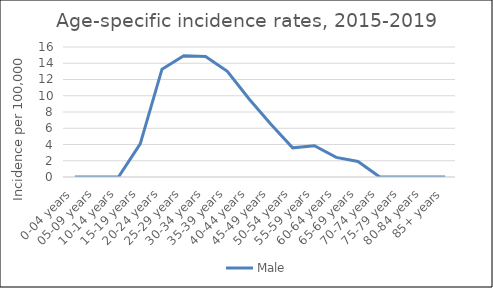
| Category | Male |
|---|---|
| 0-04 years | 0 |
| 05-09 years | 0 |
| 10-14 years | 0 |
| 15-19 years | 4.08 |
| 20-24 years | 13.28 |
| 25-29 years | 14.93 |
| 30-34 years | 14.84 |
| 35-39 years | 13.01 |
| 40-44 years | 9.6 |
| 45-49 years | 6.49 |
| 50-54 years | 3.59 |
| 55-59 years | 3.84 |
| 60-64 years | 2.41 |
| 65-69 years | 1.91 |
| 70-74 years | 0 |
| 75-79 years | 0 |
| 80-84 years | 0 |
| 85+ years | 0 |